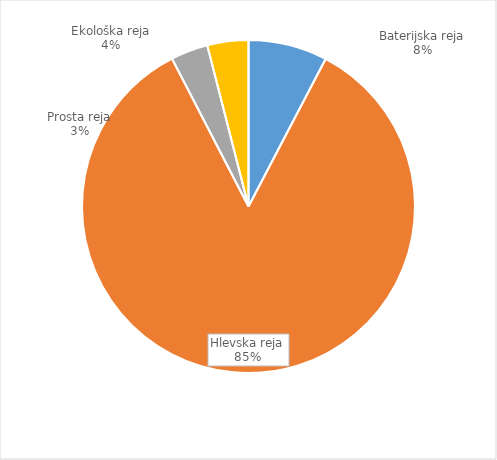
| Category | Količina kosov jajc |
|---|---|
| Baterijska reja | 248398 |
| Hlevska reja | 2746289 |
| Prosta reja | 117066 |
| Ekološka reja | 129220 |